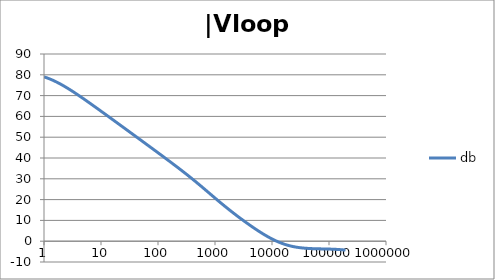
| Category | db |
|---|---|
| 1.0 | 79.011 |
| 1.0634378492473788 | 78.768 |
| 1.1309000592118907 | 78.508 |
| 1.2026419266820265 | 78.232 |
| 1.278934943925458 | 77.94 |
| 1.3600678260954062 | 77.631 |
| 1.4463476038134566 | 77.307 |
| 1.5381007850634825 | 76.967 |
| 1.6356745907936145 | 76.612 |
| 1.739438268902148 | 76.242 |
| 1.849784491579884 | 75.859 |
| 1.967130841296868 | 75.464 |
| 2.091921391056928 | 75.055 |
| 2.2246283849001642 | 74.636 |
| 2.365754025012901 | 74.206 |
| 2.5158323722080485 | 73.765 |
| 2.6754313669678584 | 73.316 |
| 2.8451549786972743 | 72.858 |
| 3.025645491321301 | 72.393 |
| 3.2175859338757533 | 71.92 |
| 3.42170266528945 | 71.441 |
| 3.6387681231394358 | 70.957 |
| 3.8696037467813236 | 70.467 |
| 4.115083085916729 | 69.972 |
| 4.376135106361553 | 69.473 |
| 4.653747705525078 | 68.97 |
| 4.948971450903514 | 68.464 |
| 5.262923555735513 | 67.954 |
| 5.596792106864742 | 67.442 |
| 5.951840560808945 | 66.928 |
| 6.329412525049976 | 66.411 |
| 6.730936842638569 | 65.892 |
| 7.157932999355504 | 65.371 |
| 7.612016873891456 | 64.849 |
| 8.094906852805886 | 64.326 |
| 8.608430333405762 | 63.801 |
| 9.154530639152917 | 63.275 |
| 9.735274373770007 | 62.749 |
| 10.352859241875105 | 62.221 |
| 11.009622365740512 | 61.693 |
| 11.708049129648925 | 61.163 |
| 12.4507825853165 | 60.634 |
| 13.240633453975693 | 60.103 |
| 14.080590762968805 | 59.573 |
| 14.973833157104059 | 59.042 |
| 15.923740927579823 | 58.51 |
| 16.93390880399795 | 57.978 |
| 18.008159557874837 | 57.446 |
| 19.150558469130036 | 56.913 |
| 20.365428710297824 | 56.381 |
| 21.65736770667993 | 55.848 |
| 23.031264534351347 | 55.315 |
| 24.492318421858034 | 54.781 |
| 26.046058425622668 | 54.248 |
| 27.698364353515743 | 53.714 |
| 29.45548901577305 | 53.18 |
| 31.32408188746347 | 52.646 |
| 33.311214272052936 | 52.112 |
| 35.42440606129053 | 51.577 |
| 37.67165419268462 | 51.043 |
| 40.06146291225952 | 50.508 |
| 42.60287595711691 | 49.973 |
| 45.30551077958928 | 49.438 |
| 48.17959494250036 | 48.903 |
| 51.23600482326248 | 48.368 |
| 54.486306773278585 | 47.832 |
| 57.94280088840825 | 47.296 |
| 61.61856755613799 | 46.76 |
| 65.52751695560372 | 46.224 |
| 69.68444169778837 | 45.687 |
| 74.10507280510043 | 45.15 |
| 78.80613924217637 | 44.613 |
| 83.8054312231895 | 44.075 |
| 89.12186753523771 | 43.536 |
| 94.77556713258299 | 42.997 |
| 100.78792527267464 | 42.458 |
| 107.18169448207877 | 41.917 |
| 113.98107065871142 | 41.376 |
| 121.21178463621371 | 40.834 |
| 128.90119955697148 | 40.292 |
| 137.07841442227294 | 39.748 |
| 145.77437421146283 | 39.203 |
| 155.02198698682062 | 38.656 |
| 164.85624842731968 | 38.108 |
| 175.3143742625403 | 37.558 |
| 186.43594110790573 | 37.007 |
| 198.26303623420247 | 36.454 |
| 210.84041683815525 | 35.898 |
| 224.21567941678887 | 35.34 |
| 238.43943988652958 | 34.779 |
| 253.56552512868072 | 34.216 |
| 269.65117668612646 | 33.649 |
| 286.75726738211927 | 33.079 |
| 304.9485316808965 | 32.506 |
| 324.2938106618788 | 31.929 |
| 344.8663125345048 | 31.348 |
| 366.7438896795682 | 30.762 |
| 390.00933326545766 | 30.173 |
| 414.7506865542229 | 29.579 |
| 441.06157808309626 | 28.982 |
| 469.0415759823428 | 28.379 |
| 498.7965647702637 | 27.773 |
| 530.4391460512702 | 27.163 |
| 564.089064633379 | 26.549 |
| 599.8736616776864 | 25.932 |
| 637.9283565946681 | 25.311 |
| 678.3971595109495 | 24.689 |
| 721.4332162458546 | 24.065 |
| 767.1993878601115 | 23.439 |
| 815.868866969862 | 22.814 |
| 867.6258331583267 | 22.188 |
| 922.6661499653554 | 21.564 |
| 981.1981060925172 | 20.941 |
| 1043.443203628628 | 20.32 |
| 1109.6369962786232 | 19.703 |
| 1180.0299807678607 | 19.089 |
| 1254.8885447951977 | 18.478 |
| 1334.4959751221782 | 17.872 |
| 1419.1535296132129 | 17.271 |
| 1509.1815772837017 | 16.674 |
| 1604.9208106703452 | 16.083 |
| 1706.7335351116335 | 15.496 |
| 1815.0050398174897 | 14.914 |
| 1930.1450559166665 | 14.338 |
| 2052.58930699948 | 13.767 |
| 2182.801158023697 | 13.2 |
| 2321.2733688234066 | 12.639 |
| 2468.5299588567814 | 12.083 |
| 2625.128190249376 | 11.531 |
| 2791.6606766374607 | 10.984 |
| 2968.757625791824 | 10.443 |
| 3157.08922450881 | 9.906 |
| 3357.3681747937244 | 9.374 |
| 3570.352390934236 | 8.847 |
| 3796.8478676703417 | 8.325 |
| 4037.7117303148448 | 7.808 |
| 4293.8554783669315 | 7.297 |
| 4566.248434893605 | 6.792 |
| 4855.9214147324665 | 6.294 |
| 5163.970625397384 | 5.802 |
| 5491.561815449236 | 5.317 |
| 5839.934686030357 | 4.839 |
| 6210.40758225729 | 4.37 |
| 6604.382482225307 | 3.91 |
| 7023.350302504747 | 3.458 |
| 7468.896540206577 | 3.017 |
| 7942.707272968458 | 2.587 |
| 8446.575539567106 | 2.169 |
| 8982.408125302747 | 1.762 |
| 9552.232777834151 | 1.369 |
| 10158.205880770249 | 0.99 |
| 10802.620614058389 | 0.625 |
| 11487.915632049675 | 0.275 |
| 12216.684292082227 | -0.059 |
| 12991.684468506162 | -0.377 |
| 13815.848989288772 | -0.679 |
| 14692.296734695852 | -0.963 |
| 15624.344440049217 | -1.231 |
| 16615.519247226184 | -1.481 |
| 17669.572052398642 | -1.714 |
| 18790.49170052441 | -1.931 |
| 19982.5200803064 | -2.131 |
| 21250.168176743602 | -2.314 |
| 22598.233142021272 | -2.482 |
| 24031.816449341983 | -2.634 |
| 25556.34319839602 | -2.773 |
| 27177.582645530147 | -2.897 |
| 28901.67003630542 | -3.008 |
| 30735.129823066054 | -3.108 |
| 32684.900355380338 | -3.196 |
| 34758.3601367905 | -3.273 |
| 36963.35574723439 | -3.341 |
| 39308.23153680468 | -3.4 |
| 41801.861203217486 | -3.451 |
| 44453.68137248706 | -3.495 |
| 47273.727309885995 | -3.533 |
| 50272.670896332245 | -3.566 |
| 53461.86101391677 | -3.594 |
| 56853.36649340195 | -3.619 |
| 60460.02178621637 | -3.64 |
| 64295.47553378361 | -3.659 |
| 68374.24221798431 | -3.676 |
| 72711.75708821259 | -3.693 |
| 77324.43457288652 | -3.709 |
| 82229.73039646025 | -3.725 |
| 87446.2076370035 | -3.742 |
| 92993.60697433475 | -3.761 |
| 98892.92139454243 | -3.781 |
| 105166.47563360249 | -3.804 |
| 111838.01066072512 | -3.83 |
| 118932.77352114675 | -3.86 |
| 126477.61287835392 | -3.893 |
| 134501.0806172993 | -3.931 |
| 143033.53989310883 | -3.974 |
| 152107.28003416685 | -4.024 |
| 161756.63873440344 | -4.079 |
| 172018.1319971993 | -4.142 |
| 182930.592322653 | -4.214 |
| 194535.31566115122 | -4.294 |